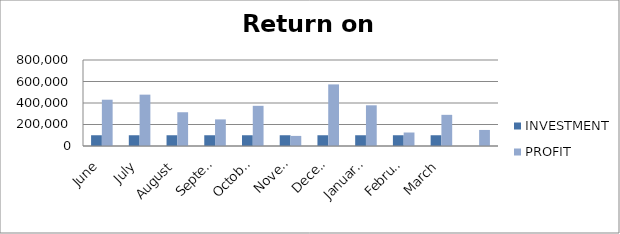
| Category | INVESTMENT  | PROFIT |
|---|---|---|
| June | 100000 | 430591 |
| July | 100000 | 477729 |
| August | 100000 | 313990 |
| September | 100000 | 247482 |
| October | 100000 | 373767 |
| November | 100000 | 93980 |
| December | 100000 | 572949 |
| January  | 100000 | 378540 |
| February | 100000 | 125515 |
| March | 100000 | 289900 |